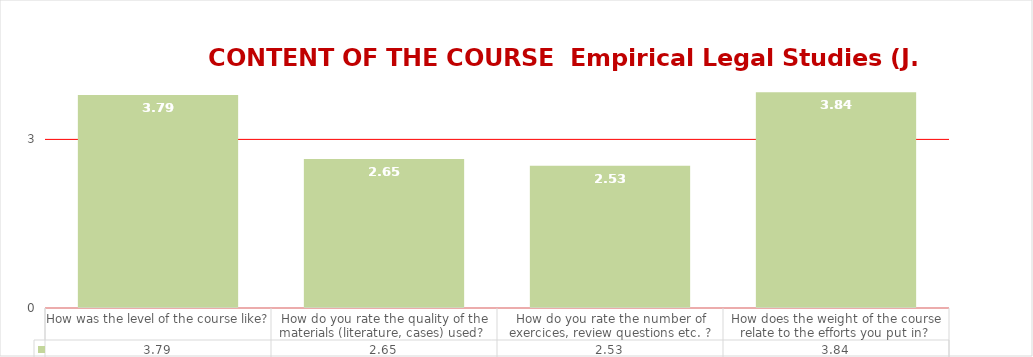
| Category | Series 0 |
|---|---|
| How was the level of the course like?  | 3.79 |
| How do you rate the quality of the materials (literature, cases) used?  | 2.65 |
| How do you rate the number of exercices, review questions etc. ? | 2.53 |
| How does the weight of the course relate to the efforts you put in?  | 3.84 |